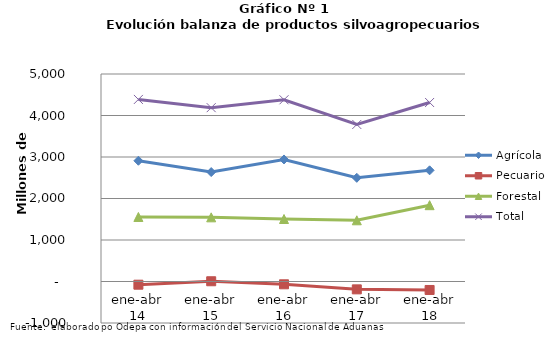
| Category | Agrícola | Pecuario | Forestal | Total |
|---|---|---|---|---|
| ene-abr 14 | 2909610 | -77047 | 1554704 | 4387267 |
| ene-abr 15 | 2637121 | 5906 | 1545961 | 4188988 |
| ene-abr 16 | 2940522 | -67410 | 1505840 | 4378952 |
| ene-abr 17 | 2498288 | -189455 | 1475069 | 3783902 |
| ene-abr 18 | 2678668 | -204256 | 1838923 | 4313335 |